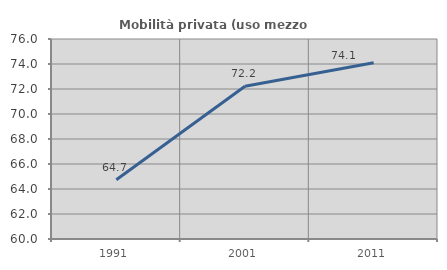
| Category | Mobilità privata (uso mezzo privato) |
|---|---|
| 1991.0 | 64.733 |
| 2001.0 | 72.222 |
| 2011.0 | 74.102 |